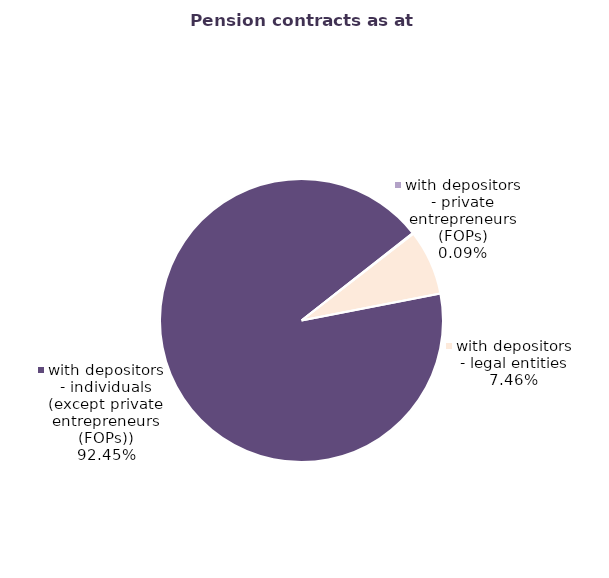
| Category | Series 0 |
|---|---|
| with depositors - individuals (except private entrepreneurs (FOPs)) | 83946 |
| with depositors - private entrepreneurs (FOPs) | 84 |
| with depositors - legal entities | 6768 |